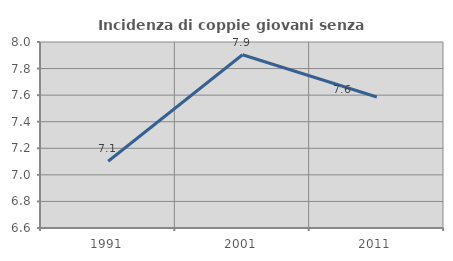
| Category | Incidenza di coppie giovani senza figli |
|---|---|
| 1991.0 | 7.102 |
| 2001.0 | 7.904 |
| 2011.0 | 7.586 |